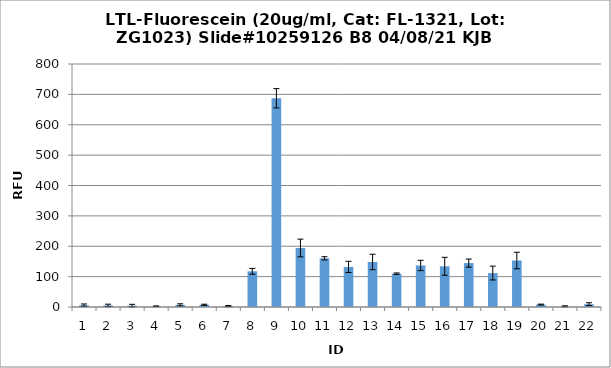
| Category | Series 0 |
|---|---|
| 0 | 6 |
| 1 | 5.25 |
| 2 | 4.5 |
| 3 | 2.5 |
| 4 | 7 |
| 5 | 7.25 |
| 6 | 3 |
| 7 | 117.5 |
| 8 | 687.25 |
| 9 | 194.25 |
| 10 | 160.25 |
| 11 | 132 |
| 12 | 148.25 |
| 13 | 109.75 |
| 14 | 136.75 |
| 15 | 134 |
| 16 | 144.5 |
| 17 | 111.75 |
| 18 | 153 |
| 19 | 8 |
| 20 | 2.25 |
| 21 | 9.25 |